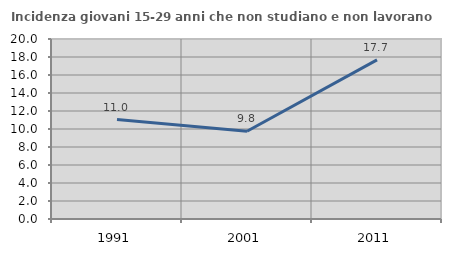
| Category | Incidenza giovani 15-29 anni che non studiano e non lavorano  |
|---|---|
| 1991.0 | 11.05 |
| 2001.0 | 9.756 |
| 2011.0 | 17.687 |